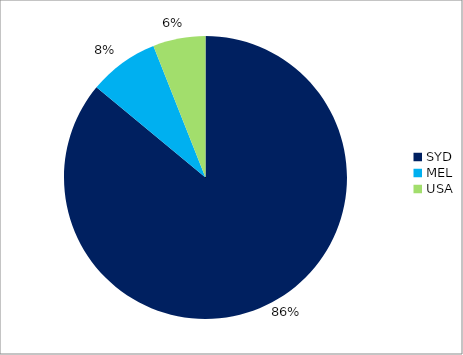
| Category | Series 0 |
|---|---|
| SYD | 0.86 |
| MEL | 0.08 |
| USA | 0.06 |